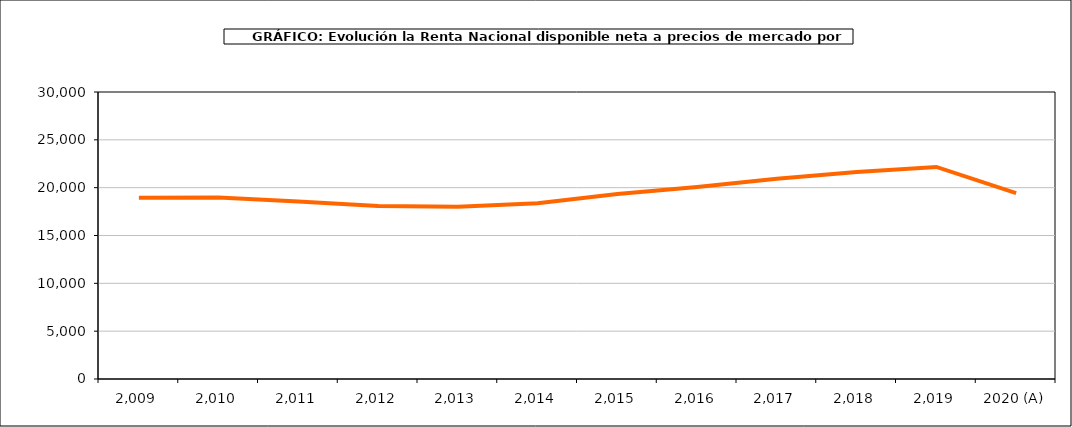
| Category | Renta por habitante |
|---|---|
| 2,009 | 18940.088 |
| 2,010 | 18962.545 |
| 2,011 | 18556.102 |
| 2,012 | 18089.488 |
| 2,013 | 17996.137 |
| 2,014 | 18366.527 |
| 2,015 | 19348.309 |
| 2,016 | 20067.75 |
| 2,017 | 20933.66 |
| 2,018 | 21630.979 |
| 2,019 | 22168.56 |
| 2020 (A) | 19429.446 |